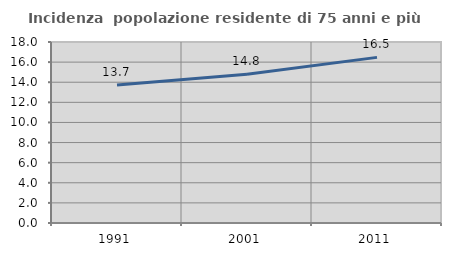
| Category | Incidenza  popolazione residente di 75 anni e più |
|---|---|
| 1991.0 | 13.721 |
| 2001.0 | 14.785 |
| 2011.0 | 16.471 |